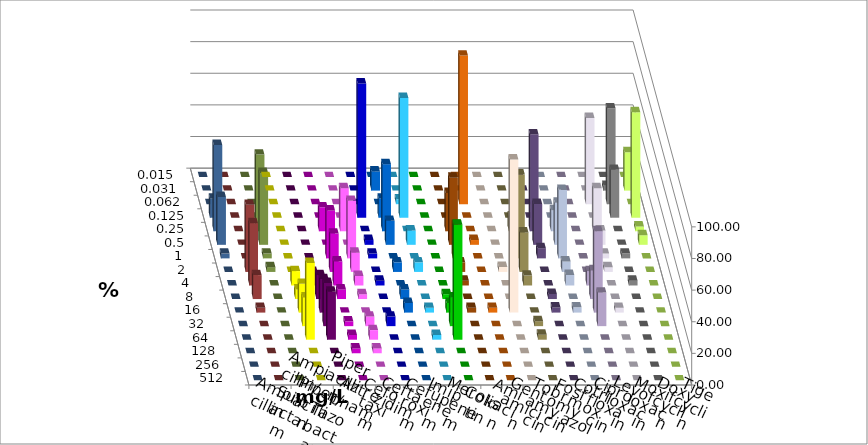
| Category | Ampicillin | Ampicillin/ Sulbactam | Piperacillin | Piperacillin/ Tazobactam | Aztreonam | Cefotaxim | Ceftazidim | Cefuroxim | Imipenem | Meropenem | Colistin | Amikacin | Gentamicin | Tobramycin | Fosfomycin | Cotrimoxazol | Ciprofloxacin | Levofloxacin | Moxifloxacin | Doxycyclin | Tigecyclin |
|---|---|---|---|---|---|---|---|---|---|---|---|---|---|---|---|---|---|---|---|---|---|
| 0.015 | 0 | 0 | 0 | 0 | 0 | 0 | 0 | 0 | 0 | 0 | 0 | 0 | 0 | 0 | 0 | 0 | 0 | 0 | 0 | 0 | 0 |
| 0.031 | 0 | 0 | 0 | 0 | 0 | 12.121 | 0 | 0 | 0 | 0 | 0 | 0 | 0 | 0 | 0 | 0 | 3.03 | 24.242 | 0 | 0 | 0 |
| 0.062 | 0 | 0 | 0 | 0 | 0 | 0 | 3.03 | 0 | 0 | 93.939 | 0 | 0 | 0 | 0 | 0 | 54.545 | 60.606 | 0 | 0 | 0 | 0 |
| 0.125 | 0 | 0 | 0 | 0 | 84.848 | 12.121 | 75.758 | 0 | 0 | 0 | 0 | 0 | 0 | 0 | 0 | 0 | 30.303 | 66.667 | 12.121 | 0 | 0 |
| 0.25 | 0 | 0 | 15.152 | 27.273 | 0 | 42.424 | 0 | 0 | 24.242 | 0 | 0 | 9.375 | 61.29 | 13.333 | 0 | 27.273 | 0 | 3.03 | 54.545 | 0 | 48.485 |
| 0.5 | 0 | 0 | 0 | 0 | 3.03 | 15.152 | 9.091 | 0 | 42.424 | 3.03 | 0 | 0 | 25.806 | 26.667 | 0 | 9.091 | 0 | 6.061 | 30.303 | 0 | 45.455 |
| 1.0 | 0 | 0 | 30.303 | 36.364 | 3.03 | 0 | 0 | 0 | 21.212 | 0 | 0 | 53.125 | 6.452 | 43.333 | 0 | 3.03 | 3.03 | 0 | 3.03 | 0 | 3.03 |
| 2.0 | 0 | 0 | 24.242 | 12.121 | 0 | 6.061 | 6.061 | 0 | 6.061 | 0 | 3.125 | 25 | 0 | 6.667 | 0 | 3.03 | 0 | 0 | 0 | 42.424 | 3.03 |
| 4.0 | 9.091 | 6.061 | 15.152 | 6.061 | 3.03 | 0 | 0 | 0 | 3.03 | 0 | 0 | 6.25 | 0 | 6.667 | 9.091 | 0 | 3.03 | 0 | 0 | 39.394 | 0 |
| 8.0 | 6.061 | 15.152 | 6.061 | 3.03 | 0 | 6.061 | 0 | 3.03 | 0 | 0 | 0 | 0 | 3.226 | 0 | 18.182 | 0 | 0 | 0 | 0 | 15.152 | 0 |
| 16.0 | 18.182 | 21.212 | 0 | 0 | 0 | 6.061 | 3.03 | 6.061 | 3.03 | 3.03 | 96.875 | 0 | 3.226 | 3.333 | 51.515 | 3.03 | 0 | 0 | 0 | 3.03 | 0 |
| 32.0 | 18.182 | 27.273 | 3.03 | 6.061 | 6.061 | 0 | 0 | 18.182 | 0 | 0 | 0 | 3.125 | 0 | 0 | 21.212 | 0 | 0 | 0 | 0 | 0 | 0 |
| 64.0 | 48.485 | 30.303 | 3.03 | 6.061 | 0 | 0 | 3.03 | 72.727 | 0 | 0 | 0 | 3.125 | 0 | 0 | 0 | 0 | 0 | 0 | 0 | 0 | 0 |
| 128.0 | 0 | 0 | 3.03 | 3.03 | 0 | 0 | 0 | 0 | 0 | 0 | 0 | 0 | 0 | 0 | 0 | 0 | 0 | 0 | 0 | 0 | 0 |
| 256.0 | 0 | 0 | 0 | 0 | 0 | 0 | 0 | 0 | 0 | 0 | 0 | 0 | 0 | 0 | 0 | 0 | 0 | 0 | 0 | 0 | 0 |
| 512.0 | 0 | 0 | 0 | 0 | 0 | 0 | 0 | 0 | 0 | 0 | 0 | 0 | 0 | 0 | 0 | 0 | 0 | 0 | 0 | 0 | 0 |